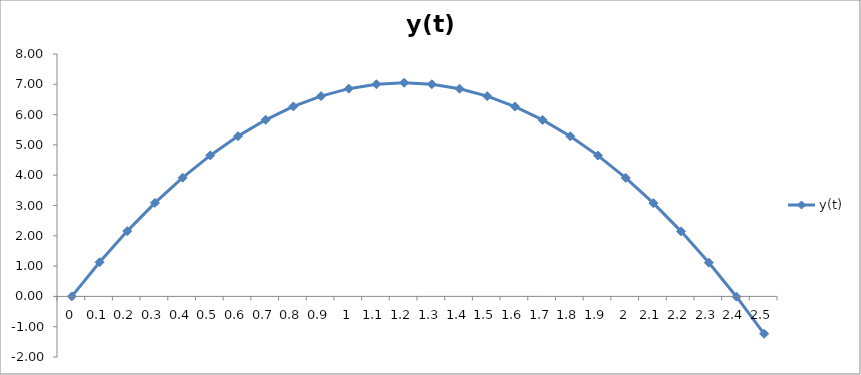
| Category | y(t) |
|---|---|
| 0.0 | 0 |
| 0.1 | 1.127 |
| 0.2 | 2.155 |
| 0.30000000000000004 | 3.086 |
| 0.4 | 3.918 |
| 0.5 | 4.653 |
| 0.6 | 5.289 |
| 0.7 | 5.828 |
| 0.7999999999999999 | 6.269 |
| 0.8999999999999999 | 6.611 |
| 0.9999999999999999 | 6.856 |
| 1.0999999999999999 | 7.002 |
| 1.2 | 7.051 |
| 1.3 | 7.001 |
| 1.4000000000000001 | 6.854 |
| 1.5000000000000002 | 6.609 |
| 1.6000000000000003 | 6.265 |
| 1.7000000000000004 | 5.824 |
| 1.8000000000000005 | 5.284 |
| 1.9000000000000006 | 4.647 |
| 2.0000000000000004 | 3.911 |
| 2.1000000000000005 | 3.078 |
| 2.2000000000000006 | 2.147 |
| 2.3000000000000007 | 1.117 |
| 2.400000000000001 | -0.01 |
| 2.500000000000001 | -1.236 |